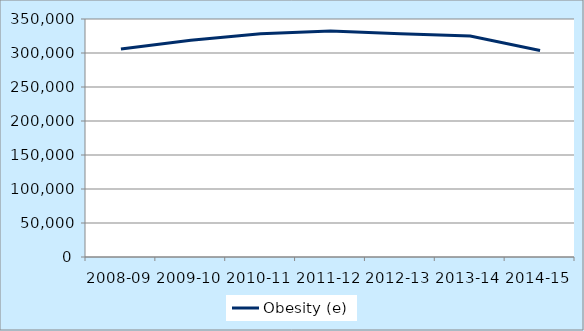
| Category | Obesity (e) |
|---|---|
| 2008-09 | 305923 |
| 2009-10 | 318606 |
| 2010-11 | 328283 |
| 2011-12 | 332229 |
| 2012-13 | 328418 |
| 2013-14 | 324878 |
| 2014-15 | 303634 |